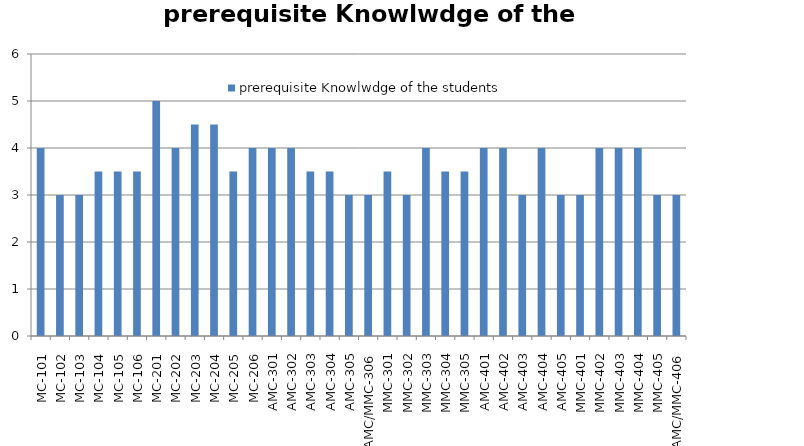
| Category | prerequisite Knowlwdge of the students |
|---|---|
| MC-101 | 4 |
| MC-102 | 3 |
| MC-103 | 3 |
| MC-104 | 3.5 |
| MC-105 | 3.5 |
| MC-106 | 3.5 |
| MC-201 | 5 |
| MC-202 | 4 |
| MC-203 | 4.5 |
| MC-204 | 4.5 |
| MC-205 | 3.5 |
| MC-206 | 4 |
| AMC-301 | 4 |
| AMC-302 | 4 |
| AMC-303 | 3.5 |
| AMC-304 | 3.5 |
| AMC-305 | 3 |
| AMC/MMC-306 | 3 |
| MMC-301 | 3.5 |
| MMC-302 | 3 |
| MMC-303 | 4 |
| MMC-304 | 3.5 |
| MMC-305 | 3.5 |
| AMC-401 | 4 |
| AMC-402 | 4 |
| AMC-403 | 3 |
| AMC-404 | 4 |
| AMC-405 | 3 |
| MMC-401 | 3 |
| MMC-402 | 4 |
| MMC-403 | 4 |
| MMC-404 | 4 |
| MMC-405 | 3 |
| AMC/MMC-406 | 3 |